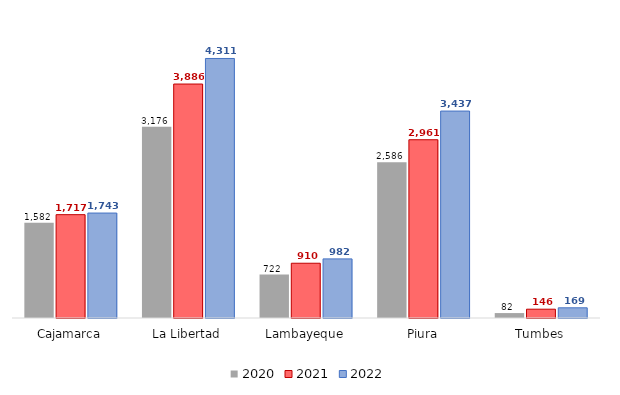
| Category | 2020 | 2021 | 2022 |
|---|---|---|---|
| Cajamarca | 1581.81 | 1716.59 | 1743.2 |
| La Libertad | 3176.07 | 3886.3 | 4310.92 |
| Lambayeque | 721.64 | 909.7 | 982.09 |
| Piura | 2586.22 | 2961.22 | 3437.43 |
| Tumbes | 82.01 | 146.24 | 169.48 |